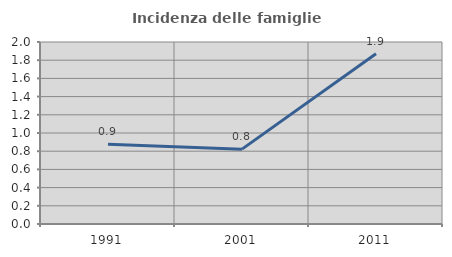
| Category | Incidenza delle famiglie numerose |
|---|---|
| 1991.0 | 0.876 |
| 2001.0 | 0.823 |
| 2011.0 | 1.87 |